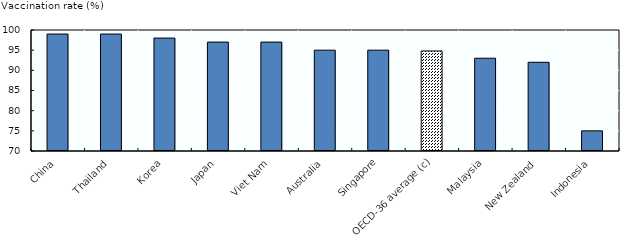
| Category | Series 1 |
|---|---|
| China | 99 |
| Thailand | 99 |
| Korea | 98 |
| Japan | 97 |
| Viet Nam | 97 |
| Australia | 95 |
| Singapore | 95 |
| OECD-36 average (c) | 94.8 |
| Malaysia | 93 |
| New Zealand | 92 |
| Indonesia | 75 |